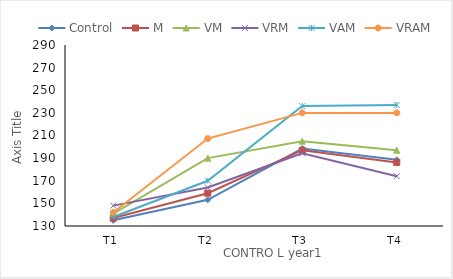
| Category | Control | M | VM | VRM | VAM | VRAM |
|---|---|---|---|---|---|---|
| T1 | 135 | 137 | 141 | 148 | 138 | 142 |
| T2 | 153.2 | 159 | 190 | 164 | 170 | 207.3 |
| T3 | 198.5 | 197 | 205 | 194.2 | 236 | 230 |
| T4 | 188.5 | 186.2 | 197 | 174 | 237 | 230 |